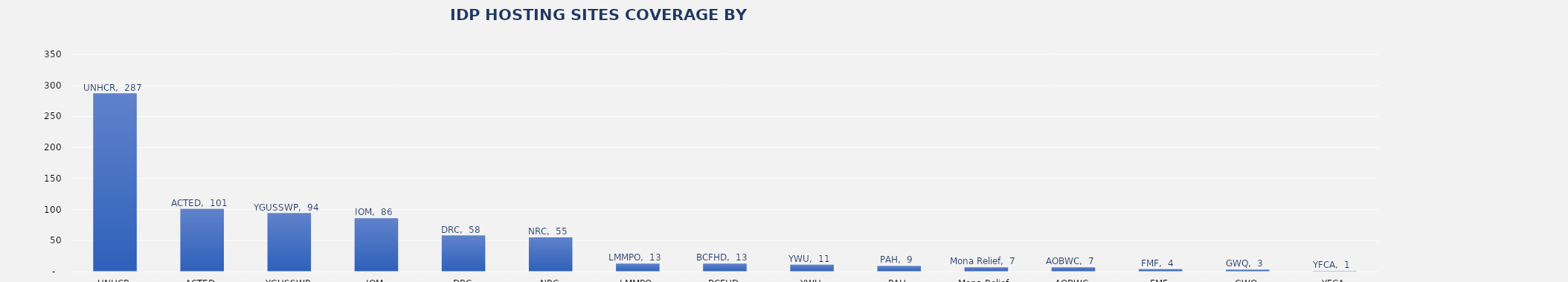
| Category | Total |
|---|---|
| UNHCR | 287 |
| ACTED | 101 |
| YGUSSWP | 94 |
| IOM | 86 |
| DRC | 58 |
| NRC | 55 |
| LMMPO | 13 |
| BCFHD | 13 |
| YWU | 11 |
| PAH | 9 |
| Mona Relief | 7 |
| AOBWC | 7 |
| FMF | 4 |
| GWQ | 3 |
| YFCA | 1 |